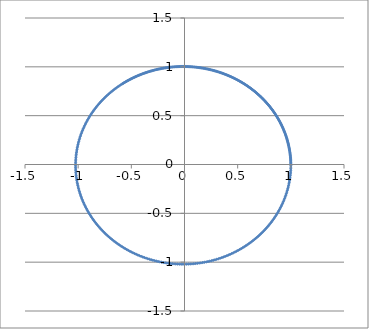
| Category | Series 0 |
|---|---|
| 1.0 | 0 |
| 0.999704940544 | 0.017 |
| 0.9991147796978569 | 0.035 |
| 0.998229565869201 | 0.052 |
| 0.997049437942986 | 0.069 |
| 0.9955746253835376 | 0.086 |
| 0.9938054483028772 | 0.104 |
| 0.9917423174951122 | 0.121 |
| 0.9893857344367074 | 0.138 |
| 0.9867362912524709 | 0.155 |
| 0.983794670647109 | 0.172 |
| 0.980561645802225 | 0.189 |
| 0.9770380802386585 | 0.206 |
| 0.973224927644082 | 0.223 |
| 0.9691232316657968 | 0.24 |
| 0.9647341256686865 | 0.256 |
| 0.9600588324583131 | 0.273 |
| 0.9550986639691623 | 0.29 |
| 0.9498550209180644 | 0.306 |
| 0.9443293924228428 | 0.323 |
| 0.9385233555862628 | 0.339 |
| 0.9324385750453774 | 0.355 |
| 0.9260768024863886 | 0.371 |
| 0.9194398761251649 | 0.387 |
| 0.912529720153581 | 0.403 |
| 0.9053483441518658 | 0.419 |
| 0.8978978424671673 | 0.434 |
| 0.8901803935585688 | 0.45 |
| 0.8821982593088096 | 0.465 |
| 0.8739537843029862 | 0.481 |
| 0.8654493950745356 | 0.496 |
| 0.8566875993188183 | 0.511 |
| 0.8476709850746466 | 0.525 |
| 0.8384022198741187 | 0.54 |
| 0.8288840498611473 | 0.555 |
| 0.8191192988790852 | 0.569 |
| 0.8091108675278759 | 0.583 |
| 0.798861732191175 | 0.597 |
| 0.7883749440339086 | 0.611 |
| 0.7776536279707544 | 0.624 |
| 0.7667009816060486 | 0.638 |
| 0.7555202741456425 | 0.651 |
| 0.744114845281249 | 0.664 |
| 0.7324881040478372 | 0.677 |
| 0.7206435276546488 | 0.69 |
| 0.708584660290431 | 0.702 |
| 0.6963151119034888 | 0.714 |
| 0.6838385569571832 | 0.726 |
| 0.6711587331615096 | 0.738 |
| 0.65827944018141 | 0.75 |
| 0.6452045383224817 | 0.761 |
| 0.6319379471947616 | 0.772 |
| 0.6184836443552753 | 0.783 |
| 0.6048456639300519 | 0.794 |
| 0.5910280952163178 | 0.804 |
| 0.5770350812655902 | 0.814 |
| 0.5628708174484032 | 0.824 |
| 0.5485395500014066 | 0.834 |
| 0.5340455745575869 | 0.843 |
| 0.5193932346603642 | 0.853 |
| 0.5045869202623309 | 0.862 |
| 0.4896310662093977 | 0.87 |
| 0.4745301507111235 | 0.879 |
| 0.45928869379800474 | 0.887 |
| 0.44391125576650897 | 0.895 |
| 0.42840243561263597 | 0.903 |
| 0.41276686945479485 | 0.91 |
| 0.397009228946786 | 0.917 |
| 0.3811342196816784 | 0.924 |
| 0.3651465795873723 | 0.931 |
| 0.3490510773146374 | 0.937 |
| 0.33285251061841536 | 0.943 |
| 0.3165557047331733 | 0.949 |
| 0.3001655107430933 | 0.954 |
| 0.28368680394787865 | 0.959 |
| 0.2671244822249551 | 0.964 |
| 0.2504834643888392 | 0.969 |
| 0.23376868854844285 | 0.973 |
| 0.21698511046307528 | 0.977 |
| 0.20013770189789998 | 0.981 |
| 0.18323144897959426 | 0.984 |
| 0.16627135055295444 | 0.988 |
| 0.14926241653918002 | 0.991 |
| 0.13220966629656214 | 0.993 |
| 0.11511812698429312 | 0.995 |
| 0.0979928319301033 | 0.997 |
| 0.08083881900242262 | 0.999 |
| 0.06366112898775289 | 1.001 |
| 0.04646480397392659 | 1.002 |
| 0.029254885739916157 | 1.003 |
| 0.012036414152846328 | 1.003 |
| -0.0051855744271500845 | 1.003 |
| -0.02240604873360511 | 1.003 |
| -0.03961998417130208 | 1.003 |
| -0.056822364384173756 | 1.002 |
| -0.0740081828129234 | 1.002 |
| -0.09117244424179412 | 1 |
| -0.10831016633392554 | 0.999 |
| -0.1254163811547511 | 0.997 |
| -0.1424861366829037 | 0.995 |
| -0.15951449830811226 | 0.993 |
| -0.1764965503155861 | 0.99 |
| -0.19342739735639933 | 0.987 |
| -0.21030216590340264 | 0.984 |
| -0.22711600569220464 | 0.98 |
| -0.24386409114678054 | 0.977 |
| -0.26054162278928145 | 0.973 |
| -0.27714382863363257 | 0.968 |
| -0.2936659655625243 | 0.964 |
| -0.31010332068741586 | 0.959 |
| -0.3264512126911865 | 0.953 |
| -0.34270499315308445 | 0.948 |
| -0.35886004785563985 | 0.942 |
| -0.3749117980732229 | 0.936 |
| -0.39085570184194357 | 0.93 |
| -0.40668725521060545 | 0.923 |
| -0.42240199347243995 | 0.917 |
| -0.4379954923773638 | 0.91 |
| -0.45346336932451603 | 0.902 |
| -0.4688012845348471 | 0.895 |
| -0.4840049422035457 | 0.887 |
| -0.4990700916321045 | 0.879 |
| -0.5139925283398402 | 0.87 |
| -0.528768095154697 | 0.862 |
| -0.5433926832831755 | 0.853 |
| -0.5578622333592456 | 0.844 |
| -0.5721727364721124 | 0.834 |
| -0.5863202351727185 | 0.825 |
| -0.600300824458879 | 0.815 |
| -0.6141106527389594 | 0.805 |
| -0.627745922774016 | 0.795 |
| -0.6412028925983341 | 0.784 |
| -0.6544778764183087 | 0.774 |
| -0.6675672454896252 | 0.763 |
| -0.6804674289727088 | 0.751 |
| -0.6931749147664217 | 0.74 |
| -0.7056862503199992 | 0.729 |
| -0.717998043423225 | 0.717 |
| -0.7301069629748571 | 0.705 |
| -0.7420097397293242 | 0.693 |
| -0.7537031670217244 | 0.68 |
| -0.7651841014711648 | 0.668 |
| -0.7764494636624903 | 0.655 |
| -0.7874962388064602 | 0.642 |
| -0.7983214773784355 | 0.629 |
| -0.8089222957356526 | 0.616 |
| -0.8192958767131632 | 0.602 |
| -0.829439470198529 | 0.588 |
| -0.8393503936853666 | 0.575 |
| -0.8490260328058434 | 0.561 |
| -0.858463841842236 | 0.547 |
| -0.8676613442176612 | 0.532 |
| -0.8766161329661041 | 0.518 |
| -0.8853258711818661 | 0.503 |
| -0.8937882924485648 | 0.489 |
| -0.9020012012478213 | 0.474 |
| -0.9099624733477751 | 0.459 |
| -0.9176700561715714 | 0.444 |
| -0.9251219691459683 | 0.428 |
| -0.932316304030218 | 0.413 |
| -0.9392512252253746 | 0.398 |
| -0.9459249700641901 | 0.382 |
| -0.9523358490817583 | 0.366 |
| -0.9584822462670712 | 0.351 |
| -0.9643626192956547 | 0.335 |
| -0.9699754997434503 | 0.319 |
| -0.9753194932821163 | 0.303 |
| -0.9803932798559165 | 0.287 |
| -0.9851956138403726 | 0.27 |
| -0.9897253241828524 | 0.254 |
| -0.9939813145252704 | 0.238 |
| -0.9979625633090751 | 0.221 |
| -1.0016681238626999 | 0.205 |
| -1.005097124471654 | 0.188 |
| -1.0082487684314285 | 0.172 |
| -1.0111223340833955 | 0.155 |
| -1.0137171748338731 | 0.138 |
| -1.016032719156535 | 0.122 |
| -1.0180684705783358 | 0.105 |
| -1.0198240076491267 | 0.088 |
| -1.0212989838951338 | 0.071 |
| -1.0224931277564702 | 0.054 |
| -1.0234062425088506 | 0.037 |
| -1.0240382061696771 | 0.021 |
| -1.024388971388662 | 0.004 |
| -1.024458565323153 | -0.013 |
| -1.0242470894983216 | -0.03 |
| -1.0237547196523762 | -0.047 |
| -1.0229817055669583 | -0.064 |
| -1.0219283708828766 | -0.08 |
| -1.0205951129013329 | -0.097 |
| -1.0189824023707914 | -0.114 |
| -1.017090783259638 | -0.131 |
| -1.0149208725147771 | -0.148 |
| -1.0124733598063074 | -0.164 |
| -1.009749007258417 | -0.181 |
| -1.0067486491666358 | -0.197 |
| -1.0034731917015778 | -0.214 |
| -0.9999236125993052 | -0.23 |
| -0.9961009608384435 | -0.247 |
| -0.9920063563041698 | -0.263 |
| -0.9876409894391994 | -0.279 |
| -0.9830061208818869 | -0.296 |
| -0.9781030810915581 | -0.312 |
| -0.9729332699611859 | -0.328 |
| -0.9674981564175176 | -0.344 |
| -0.9617992780087607 | -0.359 |
| -0.95583824047993 | -0.375 |
| -0.9496167173359534 | -0.391 |
| -0.9431364493926359 | -0.406 |
| -0.9363992443155713 | -0.422 |
| -0.9294069761470949 | -0.437 |
| -0.9221615848213606 | -0.452 |
| -0.9146650756676281 | -0.467 |
| -0.9069195189018406 | -0.482 |
| -0.8989270491065693 | -0.497 |
| -0.8906898646993997 | -0.512 |
| -0.8822102273898325 | -0.526 |
| -0.873490461624765 | -0.541 |
| -0.8645329540226216 | -0.555 |
| -0.8553401527961949 | -0.569 |
| -0.8459145671642571 | -0.583 |
| -0.8362587667520016 | -0.597 |
| -0.8263753809803681 | -0.61 |
| -0.8162670984443045 | -0.624 |
| -0.8059366662800151 | -0.637 |
| -0.7953868895212458 | -0.65 |
| -0.7846206304446477 | -0.663 |
| -0.7736408079042675 | -0.676 |
| -0.7624503966552031 | -0.688 |
| -0.7510524266664654 | -0.701 |
| -0.7394499824230852 | -0.713 |
| -0.7276462022174998 | -0.725 |
| -0.7156442774302558 | -0.737 |
| -0.7034474518000613 | -0.748 |
| -0.6910590206832181 | -0.76 |
| -0.6784823303024675 | -0.771 |
| -0.6657207769852773 | -0.782 |
| -0.6527778063916007 | -0.793 |
| -0.639656912731134 | -0.803 |
| -0.6263616379701031 | -0.813 |
| -0.6128955710276027 | -0.824 |
| -0.5992623469615183 | -0.833 |
| -0.5854656461440557 | -0.843 |
| -0.5715091934269066 | -0.852 |
| -0.5573967572960749 | -0.862 |
| -0.5431321490163924 | -0.871 |
| -0.5287192217657524 | -0.879 |
| -0.5141618697590872 | -0.888 |
| -0.49946402736212087 | -0.896 |
| -0.4846296681949261 | -0.904 |
| -0.469662804225317 | -0.912 |
| -0.45456748485211035 | -0.919 |
| -0.4393477959782896 | -0.926 |
| -0.42400785907410715 | -0.933 |
| -0.40855183023016267 | -0.94 |
| -0.3929838992004977 | -0.947 |
| -0.377308288435748 | -0.953 |
| -0.3615292521063981 | -0.959 |
| -0.34565107511618576 | -0.965 |
| -0.32967807210570543 | -0.97 |
| -0.31361458644626394 | -0.975 |
| -0.2974649892240446 | -0.98 |
| -0.2812336782146389 | -0.985 |
| -0.2649250768480091 | -0.989 |
| -0.24854363316394815 | -0.993 |
| -0.23209381875810808 | -0.997 |
| -0.21558012771867152 | -1 |
| -0.19900707555374564 | -1.004 |
| -0.18237919810956257 | -1.007 |
| -0.1657010504795744 | -1.009 |
| -0.14897720590453659 | -1.012 |
| -0.13221225466367836 | -1.014 |
| -0.11541080295706367 | -1.016 |
| -0.09857747177925258 | -1.017 |
| -0.0817168957843778 | -1.019 |
| -0.06483372214275751 | -1.02 |
| -0.04793260938917146 | -1.02 |
| -0.031018226262933532 | -1.021 |
| -0.014095250539900527 | -1.021 |
| 0.002831632143436659 | -1.021 |
| 0.01975772947362639 | -1.02 |
| 0.036678343651534245 | -1.02 |
| 0.05358877259105857 | -1.019 |
| 0.07048431112510921 | -1.018 |
| 0.08736025221866785 | -1.016 |
| 0.10421188818874053 | -1.014 |
| 0.12103451193100544 | -1.012 |
| 0.137823418152951 | -1.01 |
| 0.15457390461329146 | -1.007 |
| 0.17128127336743906 | -1.004 |
| 0.18794083201880318 | -1.001 |
| 0.20454789497567924 | -0.997 |
| 0.22109778471348104 | -0.994 |
| 0.2375858330420617 | -0.99 |
| 0.25400738237786 | -0.985 |
| 0.27035778702059965 | -0.981 |
| 0.28663241443426063 | -0.976 |
| 0.30282664653203245 | -0.971 |
| 0.3189358809649503 | -0.965 |
| 0.3349555324139058 | -0.96 |
| 0.35088103388471564 | -0.954 |
| 0.3667078380059208 | -0.947 |
| 0.38243141832898175 | -0.941 |
| 0.39804727063052386 | -0.934 |
| 0.41355091421628004 | -0.927 |
| 0.4289378932263661 | -0.92 |
| 0.4442037779415177 | -0.912 |
| 0.4593441660899061 | -0.904 |
| 0.4743546841541426 | -0.896 |
| 0.4892309886780718 | -0.888 |
| 0.5039687675729442 | -0.879 |
| 0.5185637414225507 | -0.871 |
| 0.5330116647868925 | -0.862 |
| 0.5473083275039502 | -0.852 |
| 0.5614495559891076 | -0.843 |
| 0.5754312145317788 | -0.833 |
| 0.5892492065887762 | -0.823 |
| 0.6028994760739501 | -0.813 |
| 0.6163780086436226 | -0.802 |
| 0.6296808329773301 | -0.791 |
| 0.6428040220533817 | -0.78 |
| 0.6557436944187316 | -0.769 |
| 0.6684960154526587 | -0.758 |
| 0.6810571986237379 | -0.746 |
| 0.6934235067395809 | -0.734 |
| 0.7055912531888175 | -0.722 |
| 0.7175568031747853 | -0.71 |
| 0.7293165749403827 | -0.698 |
| 0.7408670409835431 | -0.685 |
| 0.7522047292627758 | -0.672 |
| 0.7633262243922186 | -0.659 |
| 0.774228168825639 | -0.646 |
| 0.7849072640288198 | -0.633 |
| 0.7953602716397584 | -0.619 |
| 0.8055840146161078 | -0.605 |
| 0.8155753783692818 | -0.591 |
| 0.8253313118846464 | -0.577 |
| 0.834848828827215 | -0.563 |
| 0.8441250086322666 | -0.548 |
| 0.8531569975802995 | -0.534 |
| 0.8619420098557378 | -0.519 |
| 0.8704773285888031 | -0.504 |
| 0.8787603068799676 | -0.489 |
| 0.8867883688064013 | -0.474 |
| 0.8945590104098304 | -0.459 |
| 0.9020698006652254 | -0.443 |
| 0.9093183824297361 | -0.427 |
| 0.9163024733712989 | -0.412 |
| 0.923019866876339 | -0.396 |
| 0.9294684329359986 | -0.38 |
| 0.9356461190103247 | -0.364 |
| 0.9415509508698544 | -0.348 |
| 0.9471810334140418 | -0.331 |
| 0.9525345514659767 | -0.315 |
| 0.9576097705428517 | -0.299 |
| 0.9624050376016418 | -0.282 |
| 0.9669187817594673 | -0.265 |
| 0.971149514988121 | -0.249 |
| 0.9750958327822472 | -0.232 |
| 0.978756414800673 | -0.215 |
| 0.982130025480398 | -0.198 |
| 0.9852155146227631 | -0.181 |
| 0.9880118179513298 | -0.164 |
| 0.9905179576410087 | -0.147 |
| 0.9927330428179968 | -0.13 |
| 0.9946562700300874 | -0.113 |
| 0.9962869236869357 | -0.096 |
| 0.9976243764698749 | -0.078 |
| 0.9986680897108926 | -0.061 |
| 0.9994176137403935 | -0.044 |
| 0.9998725882033871 | -0.027 |
| 1.0000327423437596 | -0.009 |
| 0.9998978952563017 | 0.008 |
| 0.9994679561061844 | 0.025 |
| 0.99874292431559 | 0.042 |
| 0.9977228897172248 | 0.06 |
| 0.9964080326744594 | 0.077 |
| 0.994798624167859 | 0.094 |
| 0.9928950258478874 | 0.111 |
| 0.9906976900535874 | 0.129 |
| 0.9882071597970614 | 0.146 |
| 0.985424068713593 | 0.163 |
| 0.9823491409772762 | 0.18 |
| 0.9789831911820361 | 0.197 |
| 0.975327124187947 | 0.214 |
| 0.9713819349327762 | 0.23 |
| 0.9671487082087042 | 0.247 |
| 0.9626286184041909 | 0.264 |
| 0.9578229292109829 | 0.281 |
| 0.952732993296279 | 0.297 |
| 0.9473602519400904 | 0.314 |
| 0.941706234637859 | 0.33 |
| 0.9357725586684159 | 0.346 |
| 0.9295609286273891 | 0.362 |
| 0.9230731359261876 | 0.378 |
| 0.9163110582567143 | 0.394 |
| 0.9092766590219854 | 0.41 |
| 0.9019719867328494 | 0.426 |
| 0.8943991743710301 | 0.442 |
| 0.8865604387187334 | 0.457 |
| 0.8784580796550838 | 0.472 |
| 0.8700944794196791 | 0.487 |
| 0.8614721018435699 | 0.503 |
| 0.8525934915479971 | 0.517 |
| 0.8434612731112386 | 0.532 |
| 0.83407815020394 | 0.547 |
| 0.8244469046933228 | 0.561 |
| 0.8145703957166863 | 0.575 |
| 0.8044515587246388 | 0.589 |
| 0.7940934044945136 | 0.603 |
| 0.7834990181144444 | 0.617 |
| 0.7726715579385957 | 0.631 |
| 0.7616142545140592 | 0.644 |
| 0.7503304094799491 | 0.657 |
| 0.7388233944392444 | 0.67 |
| 0.7270966498039435 | 0.683 |
| 0.7151536836141154 | 0.695 |
| 0.702998070331445 | 0.708 |
| 0.6906334496078882 | 0.72 |
| 0.6780635250300646 | 0.732 |
| 0.6652920628400337 | 0.743 |
| 0.6523228906331102 | 0.755 |
| 0.6391598960333912 | 0.766 |
| 0.6258070253476767 | 0.777 |
| 0.6122682821984806 | 0.788 |
| 0.5985477261368365 | 0.799 |
| 0.5846494712356167 | 0.809 |
| 0.5705776846640914 | 0.819 |
| 0.5563365852444623 | 0.829 |
| 0.5419304419911166 | 0.838 |
| 0.5273635726333533 | 0.848 |
| 0.5126403421223401 | 0.857 |
| 0.49776516112306735 | 0.866 |
| 0.48274248449206936 | 0.874 |
| 0.46757680974168997 | 0.883 |
| 0.45227267549167166 | 0.891 |
| 0.4368346599088522 | 0.898 |
| 0.4212673791357552 | 0.906 |
| 0.4055754857088629 | 0.913 |
| 0.389763666967361 | 0.92 |
| 0.3738366434531453 | 0.927 |
| 0.35779916730288147 | 0.933 |
| 0.3416560206329059 | 0.94 |
| 0.32541201391775687 | 0.946 |
| 0.3090719843631215 | 0.951 |
| 0.29264079427398093 | 0.957 |
| 0.2761233294187343 | 0.962 |
| 0.2595244973900761 | 0.966 |
| 0.24284922596339825 | 0.971 |
| 0.22610246145348203 | 0.975 |
| 0.2092891670702394 | 0.979 |
| 0.19241432127425645 | 0.983 |
| 0.1754829161328851 | 0.986 |
| 0.15849995567762076 | 0.989 |
| 0.1414704542634961 | 0.992 |
| 0.1243994349312122 | 0.994 |
| 0.10729192777271851 | 0.996 |
| 0.09015296830094441 | 0.998 |
| 0.07298759582437378 | 1 |
| 0.05580085182714428 | 1.001 |
| 0.03859777835534135 | 1.002 |
| 0.02138341641014564 | 1.003 |
| 0.004162804348480764 | 1.003 |
| -0.013059023708204134 | 1.003 |
| -0.03027703945639513 | 1.003 |
| -0.04748622198360855 | 1.003 |
| -0.06468155933152472 | 1.002 |
| -0.08185805004857814 | 1.001 |
| -0.09901070473143592 | 1 |
| -0.1161345475548102 | 0.998 |
| -0.13322461778906472 | 0.996 |
| -0.15027597130509002 | 0.994 |
| -0.16728368206593666 | 0.992 |
| -0.18424284360471058 | 0.989 |
| -0.20114857048824994 | 0.986 |
| -0.21799599976611753 | 0.982 |
| -0.23478029240445858 | 0.979 |
| -0.2514966347042888 | 0.975 |
| -0.26814023970379275 | 0.971 |
| -0.28470634856422894 | 0.966 |
| -0.3011902319390521 | 0.961 |
| -0.3175871913258801 | 0.956 |
| -0.33389256040094734 | 0.951 |
| -0.35010170633570253 | 0.945 |
| -0.36621003109522393 | 0.94 |
| -0.38221297271814053 | 0.933 |
| -0.3981060065777631 | 0.927 |
| -0.413884646624144 | 0.92 |
| -0.4295444466067997 | 0.913 |
| -0.44508100127784583 | 0.906 |
| -0.4604899475753076 | 0.899 |
| -0.475766965786385 | 0.891 |
| -0.49090778069046587 | 0.883 |
| -0.5059081626816941 | 0.875 |
| -0.5207639288709149 | 0.866 |
| -0.5354709441668328 | 0.858 |
| -0.5500251223362317 | 0.849 |
| -0.5644224270431202 | 0.84 |
| -0.5786588728666787 | 0.83 |